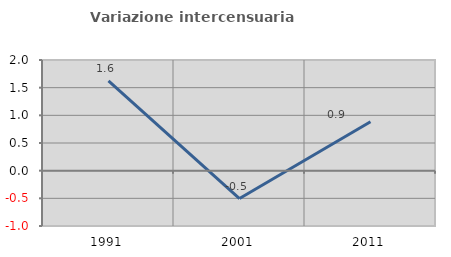
| Category | Variazione intercensuaria annua |
|---|---|
| 1991.0 | 1.622 |
| 2001.0 | -0.503 |
| 2011.0 | 0.885 |